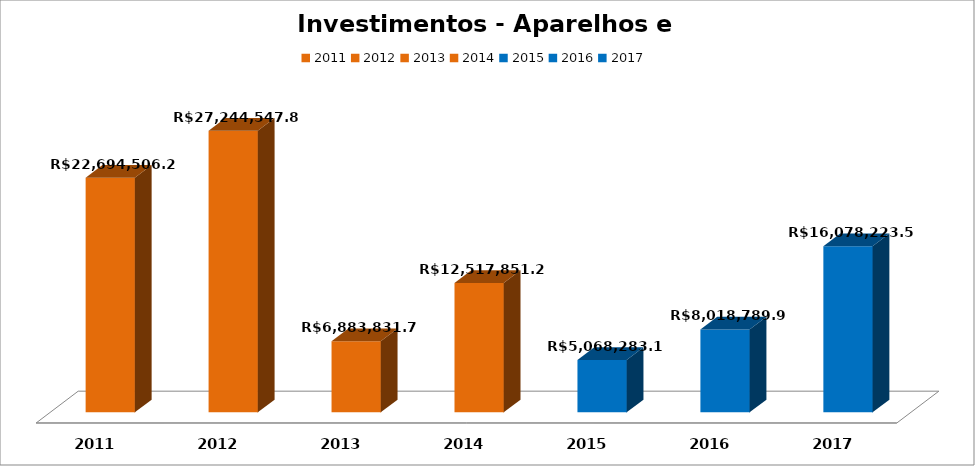
| Category | Series 1 |
|---|---|
| 2011.0 | 22694506.29 |
| 2012.0 | 27244547.88 |
| 2013.0 | 6883831.71 |
| 2014.0 | 12517851.2 |
| 2015.0 | 5068283.16 |
| 2016.0 | 8018789.93 |
| 2017.0 | 16078223.55 |